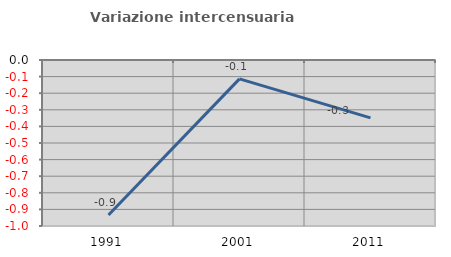
| Category | Variazione intercensuaria annua |
|---|---|
| 1991.0 | -0.934 |
| 2001.0 | -0.114 |
| 2011.0 | -0.348 |